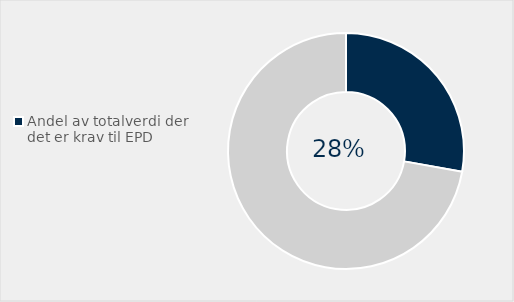
| Category | Series 0 |
|---|---|
| Andel av totalverdi der det er krav til EPD | 0.278 |
| Ikke brukt | 0.722 |